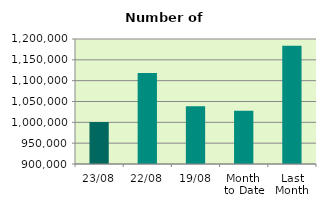
| Category | Series 0 |
|---|---|
| 23/08 | 1000694 |
| 22/08 | 1118364 |
| 19/08 | 1038726 |
| Month 
to Date | 1028032.706 |
| Last
Month | 1183989.81 |